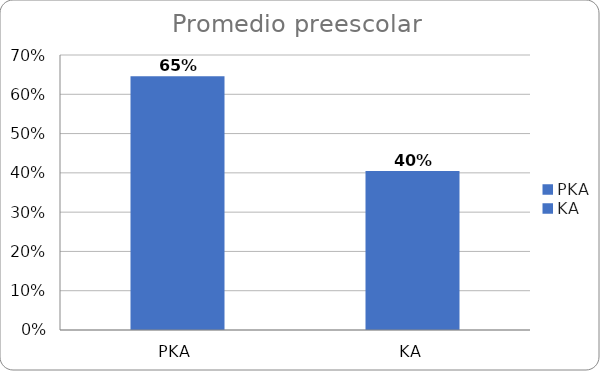
| Category | Series 0 |
|---|---|
| PKA | 0.646 |
| KA | 0.405 |